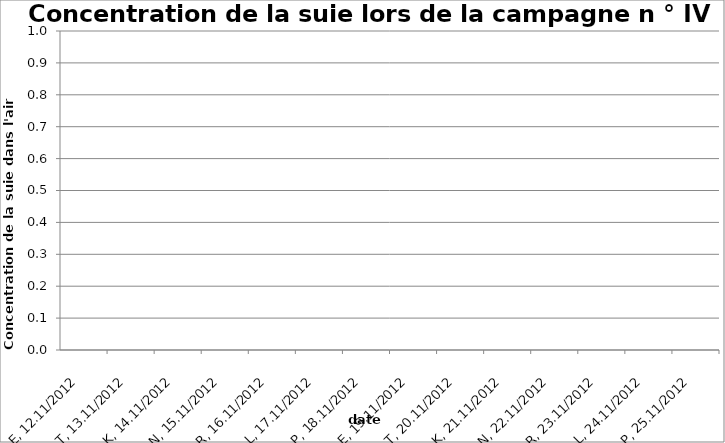
| Category | Series 0 |
|---|---|
| 2012-11-12 | 0 |
| 2012-11-13 | 0 |
| 2012-11-14 | 0 |
| 2012-11-15 | 0 |
| 2012-11-16 | 0 |
| 2012-11-17 | 0 |
| 2012-11-18 | 0 |
| 2012-11-19 | 0 |
| 2012-11-20 | 0 |
| 2012-11-21 | 0 |
| 2012-11-22 | 0 |
| 2012-11-23 | 0 |
| 2012-11-24 | 0 |
| 2012-11-25 | 0 |